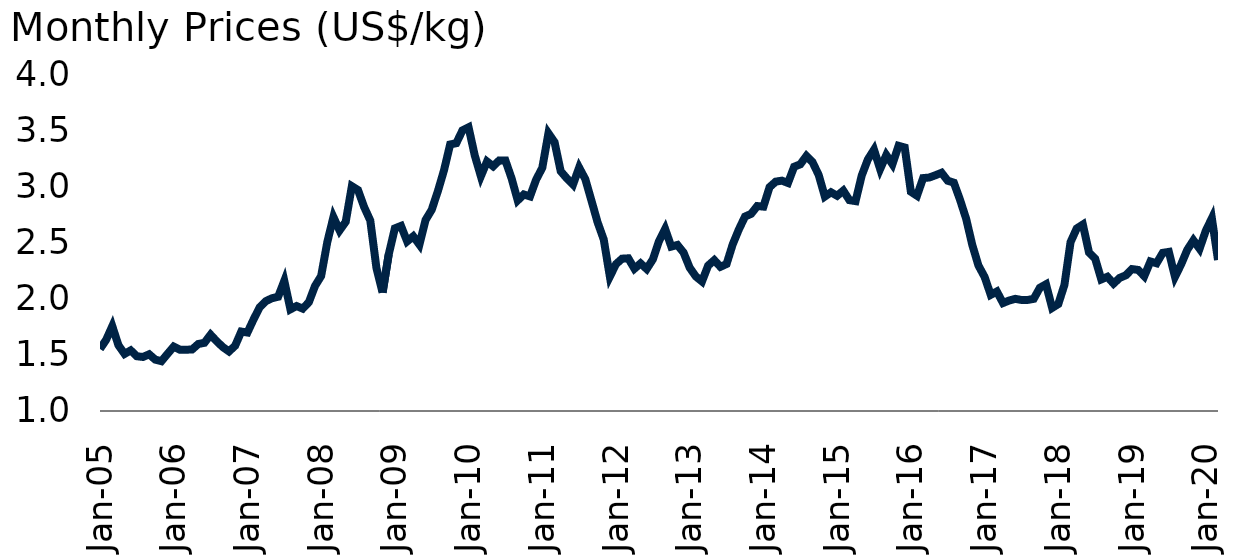
| Category | Cocoa |
|---|---|
| 2005-01-01 | 1.552 |
| 2005-02-01 | 1.634 |
| 2005-03-01 | 1.755 |
| 2005-04-01 | 1.586 |
| 2005-05-01 | 1.508 |
| 2005-06-01 | 1.54 |
| 2005-07-01 | 1.487 |
| 2005-08-01 | 1.481 |
| 2005-09-01 | 1.505 |
| 2005-10-01 | 1.457 |
| 2005-11-01 | 1.443 |
| 2005-12-01 | 1.509 |
| 2006-01-01 | 1.573 |
| 2006-02-01 | 1.546 |
| 2006-03-01 | 1.545 |
| 2006-04-01 | 1.548 |
| 2006-05-01 | 1.596 |
| 2006-06-01 | 1.607 |
| 2006-07-01 | 1.679 |
| 2006-08-01 | 1.621 |
| 2006-09-01 | 1.569 |
| 2006-10-01 | 1.53 |
| 2006-11-01 | 1.581 |
| 2006-12-01 | 1.707 |
| 2007-01-01 | 1.699 |
| 2007-02-01 | 1.815 |
| 2007-03-01 | 1.924 |
| 2007-04-01 | 1.978 |
| 2007-05-01 | 2.004 |
| 2007-06-01 | 2.017 |
| 2007-07-01 | 2.158 |
| 2007-08-01 | 1.905 |
| 2007-09-01 | 1.934 |
| 2007-10-01 | 1.911 |
| 2007-11-01 | 1.968 |
| 2007-12-01 | 2.113 |
| 2008-01-01 | 2.201 |
| 2008-02-01 | 2.504 |
| 2008-03-01 | 2.726 |
| 2008-04-01 | 2.608 |
| 2008-05-01 | 2.684 |
| 2008-06-01 | 3.001 |
| 2008-07-01 | 2.967 |
| 2008-08-01 | 2.816 |
| 2008-09-01 | 2.696 |
| 2008-10-01 | 2.274 |
| 2008-11-01 | 2.055 |
| 2008-12-01 | 2.394 |
| 2009-01-01 | 2.626 |
| 2009-02-01 | 2.648 |
| 2009-03-01 | 2.51 |
| 2009-04-01 | 2.555 |
| 2009-05-01 | 2.481 |
| 2009-06-01 | 2.7 |
| 2009-07-01 | 2.791 |
| 2009-08-01 | 2.957 |
| 2009-09-01 | 3.143 |
| 2009-10-01 | 3.373 |
| 2009-11-01 | 3.384 |
| 2009-12-01 | 3.498 |
| 2010-01-01 | 3.525 |
| 2010-02-01 | 3.277 |
| 2010-03-01 | 3.09 |
| 2010-04-01 | 3.221 |
| 2010-05-01 | 3.178 |
| 2010-06-01 | 3.231 |
| 2010-07-01 | 3.23 |
| 2010-08-01 | 3.072 |
| 2010-09-01 | 2.875 |
| 2010-10-01 | 2.928 |
| 2010-11-01 | 2.91 |
| 2010-12-01 | 3.06 |
| 2011-01-01 | 3.165 |
| 2011-02-01 | 3.472 |
| 2011-03-01 | 3.393 |
| 2011-04-01 | 3.134 |
| 2011-05-01 | 3.071 |
| 2011-06-01 | 3.016 |
| 2011-07-01 | 3.167 |
| 2011-08-01 | 3.064 |
| 2011-09-01 | 2.874 |
| 2011-10-01 | 2.68 |
| 2011-11-01 | 2.527 |
| 2011-12-01 | 2.197 |
| 2012-01-01 | 2.308 |
| 2012-02-01 | 2.356 |
| 2012-03-01 | 2.359 |
| 2012-04-01 | 2.267 |
| 2012-05-01 | 2.314 |
| 2012-06-01 | 2.264 |
| 2012-07-01 | 2.35 |
| 2012-08-01 | 2.512 |
| 2012-09-01 | 2.62 |
| 2012-10-01 | 2.464 |
| 2012-11-01 | 2.478 |
| 2012-12-01 | 2.41 |
| 2013-01-01 | 2.275 |
| 2013-02-01 | 2.198 |
| 2013-03-01 | 2.153 |
| 2013-04-01 | 2.294 |
| 2013-05-01 | 2.343 |
| 2013-06-01 | 2.284 |
| 2013-07-01 | 2.309 |
| 2013-08-01 | 2.484 |
| 2013-09-01 | 2.616 |
| 2013-10-01 | 2.731 |
| 2013-11-01 | 2.755 |
| 2013-12-01 | 2.825 |
| 2014-01-01 | 2.819 |
| 2014-02-01 | 2.993 |
| 2014-03-01 | 3.042 |
| 2014-04-01 | 3.051 |
| 2014-05-01 | 3.03 |
| 2014-06-01 | 3.174 |
| 2014-07-01 | 3.196 |
| 2014-08-01 | 3.27 |
| 2014-09-01 | 3.215 |
| 2014-10-01 | 3.101 |
| 2014-11-01 | 2.909 |
| 2014-12-01 | 2.947 |
| 2015-01-01 | 2.916 |
| 2015-02-01 | 2.962 |
| 2015-03-01 | 2.877 |
| 2015-04-01 | 2.868 |
| 2015-05-01 | 3.096 |
| 2015-06-01 | 3.24 |
| 2015-07-01 | 3.326 |
| 2015-08-01 | 3.154 |
| 2015-09-01 | 3.278 |
| 2015-10-01 | 3.197 |
| 2015-11-01 | 3.361 |
| 2015-12-01 | 3.346 |
| 2016-01-01 | 2.952 |
| 2016-02-01 | 2.916 |
| 2016-03-01 | 3.074 |
| 2016-04-01 | 3.078 |
| 2016-05-01 | 3.099 |
| 2016-06-01 | 3.121 |
| 2016-07-01 | 3.05 |
| 2016-08-01 | 3.032 |
| 2016-09-01 | 2.881 |
| 2016-10-01 | 2.711 |
| 2016-11-01 | 2.479 |
| 2016-12-01 | 2.295 |
| 2017-01-01 | 2.194 |
| 2017-02-01 | 2.034 |
| 2017-03-01 | 2.064 |
| 2017-04-01 | 1.961 |
| 2017-05-01 | 1.983 |
| 2017-06-01 | 1.998 |
| 2017-07-01 | 1.989 |
| 2017-08-01 | 1.989 |
| 2017-09-01 | 1.998 |
| 2017-10-01 | 2.097 |
| 2017-11-01 | 2.128 |
| 2017-12-01 | 1.918 |
| 2018-01-01 | 1.952 |
| 2018-02-01 | 2.123 |
| 2018-03-01 | 2.504 |
| 2018-04-01 | 2.625 |
| 2018-05-01 | 2.66 |
| 2018-06-01 | 2.411 |
| 2018-07-01 | 2.357 |
| 2018-08-01 | 2.172 |
| 2018-09-01 | 2.195 |
| 2018-10-01 | 2.134 |
| 2018-11-01 | 2.185 |
| 2018-12-01 | 2.208 |
| 2019-01-01 | 2.263 |
| 2019-02-01 | 2.256 |
| 2019-03-01 | 2.2 |
| 2019-04-01 | 2.331 |
| 2019-05-01 | 2.315 |
| 2019-06-01 | 2.408 |
| 2019-07-01 | 2.417 |
| 2019-08-01 | 2.195 |
| 2019-09-01 | 2.305 |
| 2019-10-01 | 2.435 |
| 2019-11-01 | 2.52 |
| 2019-12-01 | 2.445 |
| 2020-01-01 | 2.603 |
| 2020-02-01 | 2.716 |
| 2020-03-01 | 2.344 |